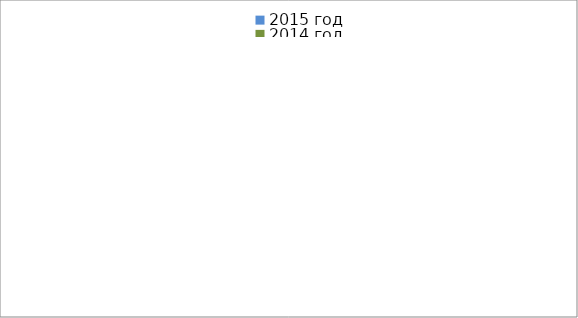
| Category | 2015 год | 2014 год |
|---|---|---|
|  - поджог | 30 | 26 |
|  - неосторожное обращение с огнём | 66 | 46 |
|  - НПТЭ электрооборудования | 10 | 21 |
|  - НПУ и Э печей | 75 | 74 |
|  - НПУ и Э транспортных средств | 46 | 71 |
|   -Шалость с огнем детей | 3 | 0 |
|  -НППБ при эксплуатации эл.приборов | 14 | 21 |
|  - курение | 26 | 22 |
| - прочие | 105 | 108 |
| - не установленные причины | 16 | 10 |